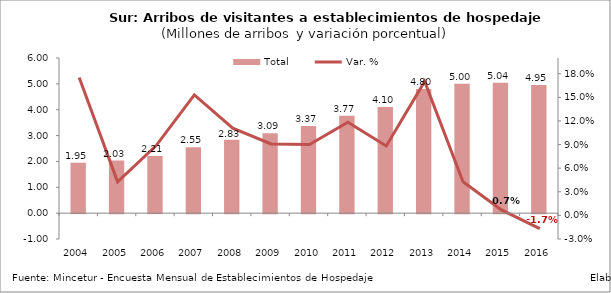
| Category | Total |
|---|---|
| 2004 | 1.95 |
| 2005 | 2.033 |
| 2006 | 2.213 |
| 2007 | 2.552 |
| 2008 | 2.835 |
| 2009 | 3.092 |
| 2010 | 3.37 |
| 2011 | 3.769 |
| 2012 | 4.102 |
| 2013 | 4.8 |
| 2014 | 5.005 |
| 2015 | 5.04 |
| 2016 | 4.955 |